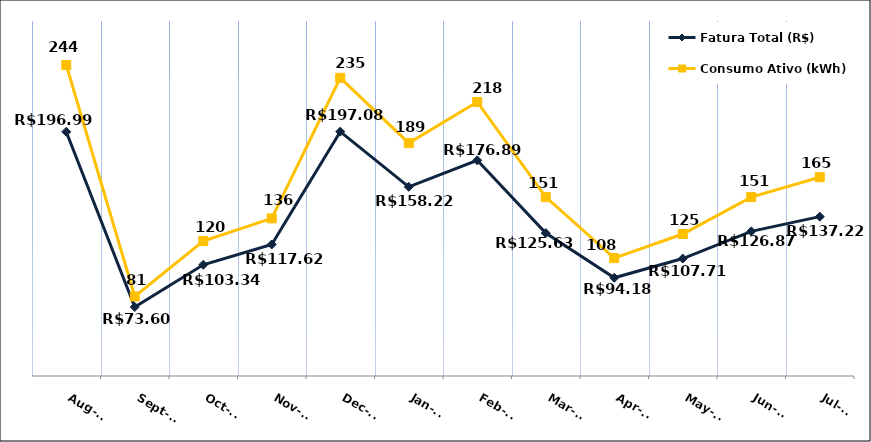
| Category | Fatura Total (R$) |
|---|---|
| 2023-08-01 | 196.99 |
| 2023-09-01 | 73.6 |
| 2023-10-01 | 103.34 |
| 2023-11-01 | 117.62 |
| 2023-12-01 | 197.08 |
| 2024-01-01 | 158.22 |
| 2024-02-01 | 176.89 |
| 2024-03-01 | 125.63 |
| 2024-04-01 | 94.18 |
| 2024-05-01 | 107.71 |
| 2024-06-01 | 126.87 |
| 2024-07-01 | 137.22 |